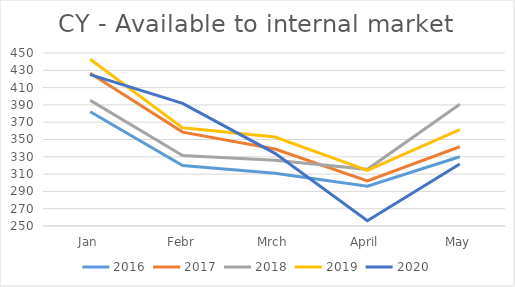
| Category | 2016 | 2017 | 2018 | 2019 | 2020 |
|---|---|---|---|---|---|
| Jan | 382 | 426.486 | 395.254 | 442.695 | 424.945 |
| Febr | 320 | 358.529 | 331.371 | 363.488 | 391.731 |
| Mrch | 311 | 339.013 | 325.887 | 352.777 | 334.005 |
| April | 296 | 302.027 | 315.499 | 314.17 | 256.017 |
| May | 330 | 341.594 | 390.76 | 361.543 | 321.727 |